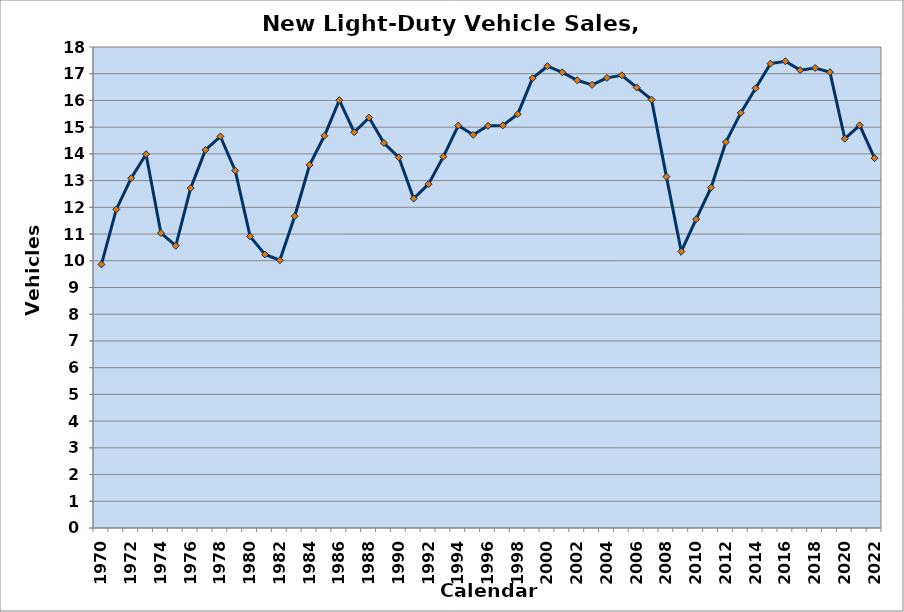
| Category | Series 0 |
|---|---|
| 1970.0 | 9.862 |
| 1971.0 | 11.921 |
| 1972.0 | 13.093 |
| 1973.0 | 13.986 |
| 1974.0 | 11.037 |
| 1975.0 | 10.562 |
| 1976.0 | 12.719 |
| 1977.0 | 14.149 |
| 1978.0 | 14.654 |
| 1979.0 | 13.372 |
| 1980.0 | 10.913 |
| 1981.0 | 10.235 |
| 1982.0 | 10.02 |
| 1983.0 | 11.669 |
| 1984.0 | 13.585 |
| 1985.0 | 14.678 |
| 1986.0 | 16.01 |
| 1987.0 | 14.811 |
| 1988.0 | 15.358 |
| 1989.0 | 14.405 |
| 1990.0 | 13.87 |
| 1991.0 | 12.328 |
| 1992.0 | 12.868 |
| 1993.0 | 13.896 |
| 1994.0 | 15.059 |
| 1995.0 | 14.713 |
| 1996.0 | 15.05 |
| 1997.0 | 15.067 |
| 1998.0 | 15.486 |
| 1999.0 | 16.833 |
| 2000.0 | 17.281 |
| 2001.0 | 17.052 |
| 2002.0 | 16.755 |
| 2003.0 | 16.585 |
| 2004.0 | 16.844 |
| 2005.0 | 16.941 |
| 2006.0 | 16.486 |
| 2007.0 | 16.033 |
| 2008.0 | 13.15 |
| 2009.0 | 10.348 |
| 2010.0 | 11.555 |
| 2011.0 | 12.737 |
| 2012.0 | 14.443 |
| 2013.0 | 15.533 |
| 2014.0 | 16.456 |
| 2015.0 | 17.378 |
| 2016.0 | 17.465 |
| 2017.0 | 17.135 |
| 2018.0 | 17.214 |
| 2019.0 | 17.058 |
| 2020.0 | 14.568 |
| 2021.0 | 15.071 |
| 2022.0 | 13.84 |